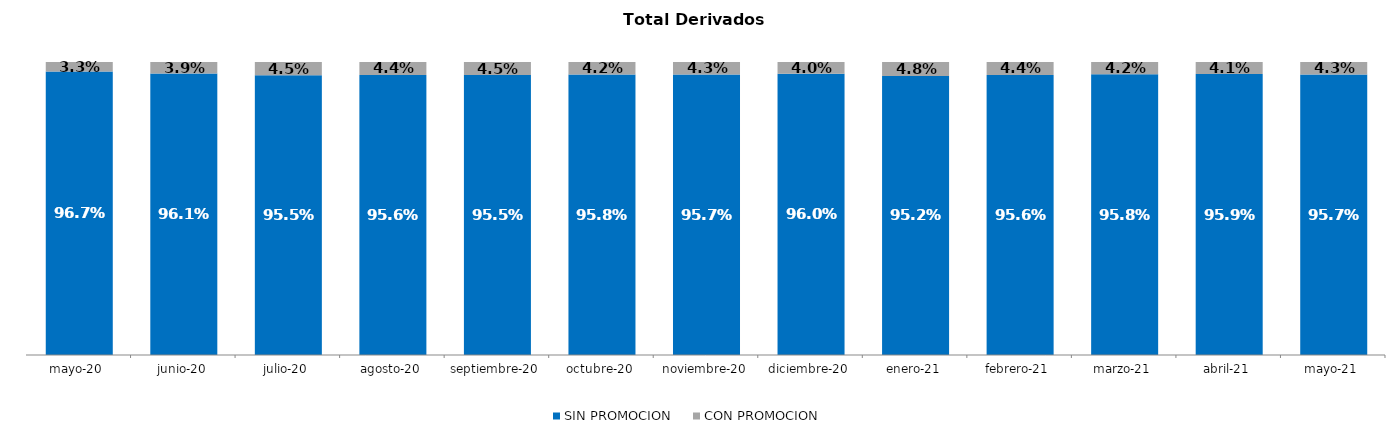
| Category | SIN PROMOCION   | CON PROMOCION   |
|---|---|---|
| 2020-05-01 | 0.967 | 0.033 |
| 2020-06-01 | 0.961 | 0.039 |
| 2020-07-01 | 0.955 | 0.045 |
| 2020-08-01 | 0.956 | 0.044 |
| 2020-09-01 | 0.955 | 0.045 |
| 2020-10-01 | 0.958 | 0.042 |
| 2020-11-01 | 0.957 | 0.043 |
| 2020-12-01 | 0.96 | 0.04 |
| 2021-01-01 | 0.952 | 0.048 |
| 2021-02-01 | 0.956 | 0.044 |
| 2021-03-01 | 0.958 | 0.042 |
| 2021-04-01 | 0.959 | 0.041 |
| 2021-05-01 | 0.957 | 0.043 |